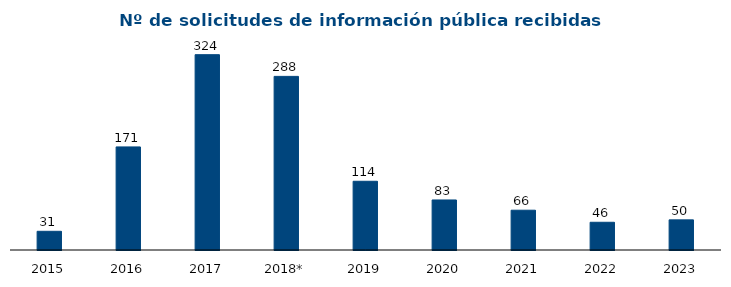
| Category | Series 1 |
|---|---|
| 2015 | 31 |
| 2016 | 171 |
| 2017 | 324 |
| 2018* | 288 |
| 2019 | 114 |
| 2020 | 83 |
| 2021 | 66 |
| 2022 | 46 |
| 2023 | 50 |